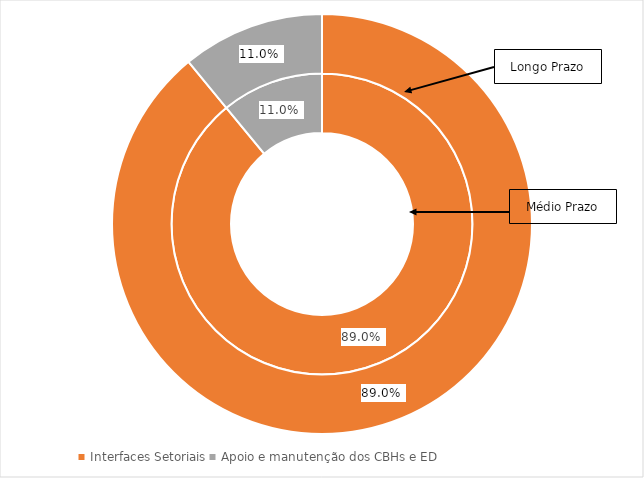
| Category | Curto Prazo (%) | Médio Prazo (%) | Longo Prazo (%) |
|---|---|---|---|
| Recursos Hídricos | 0 | 0 | 0 |
| Interfaces Setoriais | 0 | 0.89 | 0.89 |
| Apoio e manutenção dos CBHs e ED | 0 | 0.11 | 0.11 |